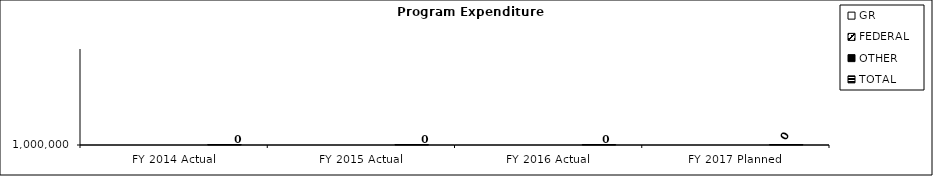
| Category | GR | FEDERAL | OTHER | TOTAL |
|---|---|---|---|---|
| FY 2014 Actual |  |  |  | 0 |
| FY 2015 Actual |  |  |  | 0 |
| FY 2016 Actual |  |  |  | 0 |
| FY 2017 Planned |  |  |  | 0 |